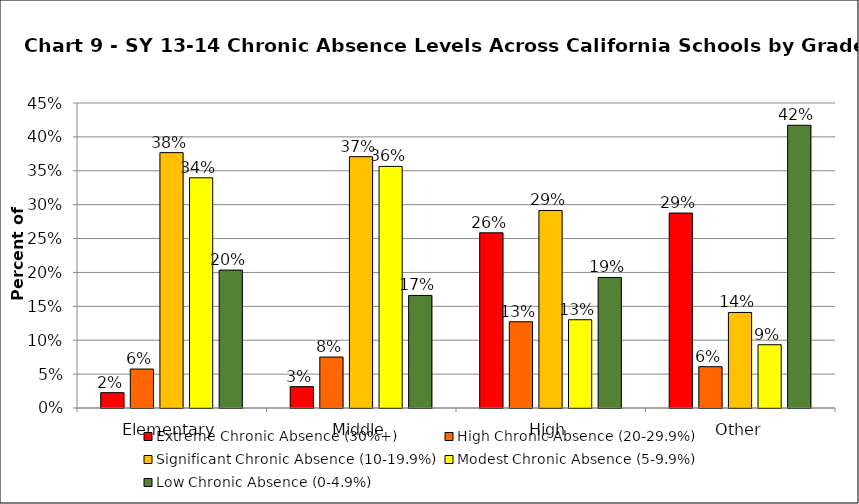
| Category | Extreme Chronic Absence (30%+) | High Chronic Absence (20-29.9%) | Significant Chronic Absence (10-19.9%) | Modest Chronic Absence (5-9.9%) | Low Chronic Absence (0-4.9%) |
|---|---|---|---|---|---|
| 0 | 0.023 | 0.057 | 0.377 | 0.34 | 0.203 |
| 1 | 0.031 | 0.075 | 0.371 | 0.356 | 0.166 |
| 2 | 0.258 | 0.127 | 0.291 | 0.13 | 0.193 |
| 3 | 0.288 | 0.061 | 0.141 | 0.093 | 0.417 |